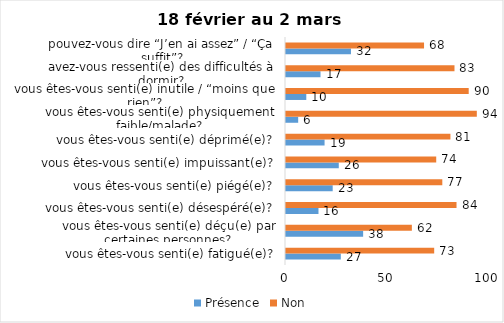
| Category | Présence | Non |
|---|---|---|
| vous êtes-vous senti(e) fatigué(e)? | 27 | 73 |
| vous êtes-vous senti(e) déçu(e) par certaines personnes? | 38 | 62 |
| vous êtes-vous senti(e) désespéré(e)? | 16 | 84 |
| vous êtes-vous senti(e) piégé(e)? | 23 | 77 |
| vous êtes-vous senti(e) impuissant(e)? | 26 | 74 |
| vous êtes-vous senti(e) déprimé(e)? | 19 | 81 |
| vous êtes-vous senti(e) physiquement faible/malade? | 6 | 94 |
| vous êtes-vous senti(e) inutile / “moins que rien”? | 10 | 90 |
| avez-vous ressenti(e) des difficultés à dormir? | 17 | 83 |
| pouvez-vous dire “J’en ai assez” / “Ça suffit”? | 32 | 68 |